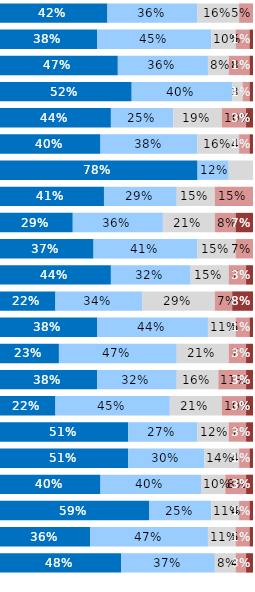
| Category | Almost Always or Always | Usually | Occasionally | Seldom | Never or Almost Never |
|---|---|---|---|---|---|
| Q1 | 0.425 | 0.356 | 0.164 | 0.055 | 0 |
| Q2 | 0.384 | 0.452 | 0.096 | 0.055 | 0.014 |
| Q3 | 0.466 | 0.356 | 0.082 | 0.082 | 0.014 |
| Q4 | 0.521 | 0.397 | 0.041 | 0.027 | 0.014 |
| Q5 | 0.438 | 0.247 | 0.192 | 0.096 | 0.027 |
| Q6 | 0.397 | 0.384 | 0.164 | 0.041 | 0.014 |
| Q7 | 0.781 | 0.123 | 0.096 | 0 | 0 |
| Q8 | 0.411 | 0.288 | 0.151 | 0.151 | 0 |
| Q9 | 0.288 | 0.356 | 0.205 | 0.082 | 0.068 |
| Q10 | 0.37 | 0.411 | 0.151 | 0.068 | 0 |
| Q11 | 0.438 | 0.315 | 0.151 | 0.068 | 0.027 |
| Q12 | 0.219 | 0.342 | 0.288 | 0.068 | 0.082 |
| Q13 | 0.384 | 0.438 | 0.11 | 0.055 | 0.014 |
| Q14 | 0.233 | 0.466 | 0.205 | 0.068 | 0.027 |
| Q15 | 0.384 | 0.315 | 0.164 | 0.11 | 0.027 |
| Q16 | 0.219 | 0.452 | 0.205 | 0.096 | 0.027 |
| Q17 | 0.507 | 0.274 | 0.123 | 0.068 | 0.027 |
| Q18 | 0.507 | 0.301 | 0.137 | 0.041 | 0.014 |
| Q19 | 0.397 | 0.397 | 0.096 | 0.082 | 0.027 |
| Q20 | 0.589 | 0.247 | 0.11 | 0.041 | 0.014 |
| Q21 | 0.356 | 0.466 | 0.11 | 0.055 | 0.014 |
| Q22 | 0.479 | 0.37 | 0.082 | 0.041 | 0.027 |